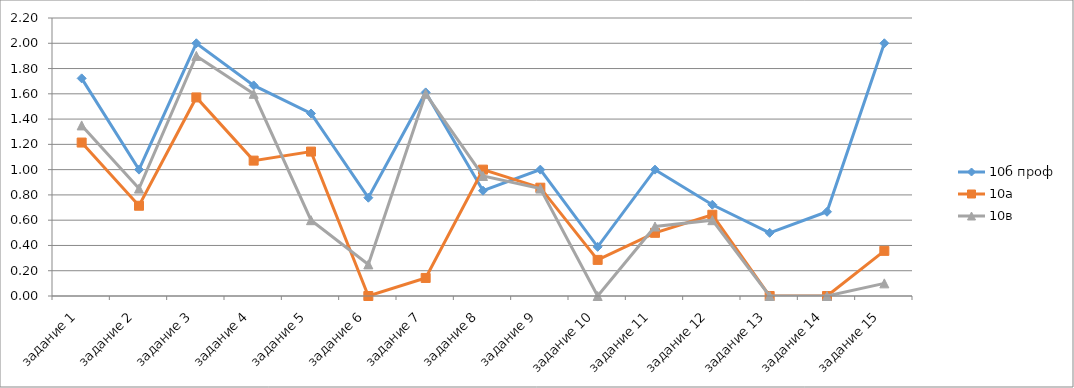
| Category | 10б проф | 10а | 10в |
|---|---|---|---|
| задание 1 | 1.722 | 1.214 | 1.35 |
| задание 2 | 1 | 0.714 | 0.85 |
| задание 3 | 2 | 1.571 | 1.9 |
| задание 4 | 1.667 | 1.071 | 1.6 |
| задание 5 | 1.444 | 1.143 | 0.6 |
| задание 6 | 0.778 | 0 | 0.25 |
| задание 7 | 1.611 | 0.143 | 1.6 |
| задание 8 | 0.833 | 1 | 0.95 |
| задание 9 | 1 | 0.857 | 0.85 |
| задание 10 | 0.389 | 0.286 | 0 |
| задание 11 | 1 | 0.5 | 0.55 |
| задание 12 | 0.722 | 0.643 | 0.6 |
| задание 13 | 0.5 | 0 | 0 |
| задание 14 | 0.667 | 0 | 0 |
| задание 15 | 2 | 0.357 | 0.1 |